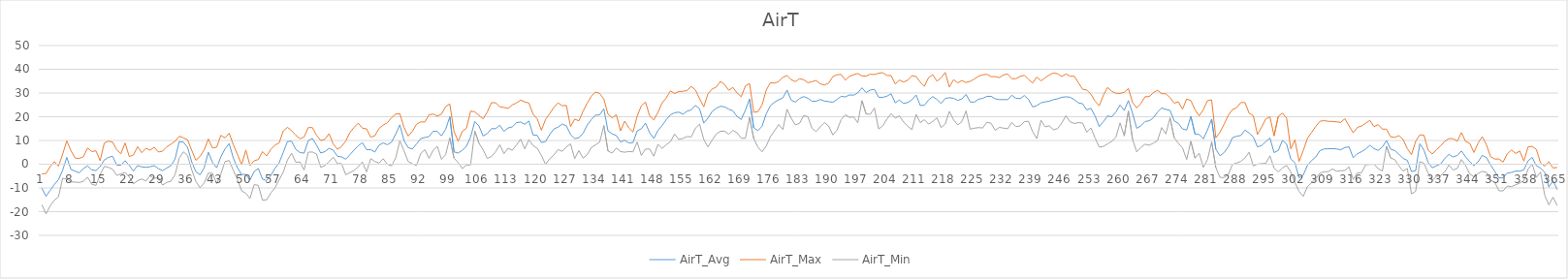
| Category | AirT_Avg | AirT_Max | AirT_Min |
|---|---|---|---|
| 0 | -10.09 | -4.06 | -17.07 |
| 1 | -13.53 | -3.93 | -20.97 |
| 2 | -10.99 | -1.04 | -17.57 |
| 3 | -8.54 | 1.11 | -15.17 |
| 4 | -6.53 | -0.81 | -13.77 |
| 5 | -2.54 | 4.24 | -5.93 |
| 6 | 2.87 | 9.84 | -6.26 |
| 7 | -2.27 | 5.65 | -7.48 |
| 8 | -2.92 | 2.6 | -7.51 |
| 9 | -3.63 | 2.43 | -7.71 |
| 10 | -1.83 | 3.17 | -7.18 |
| 11 | -0.67 | 6.86 | -5.51 |
| 12 | -2.39 | 5.33 | -8.49 |
| 13 | -2.67 | 5.64 | -8.93 |
| 14 | -1.03 | 1.46 | -4.4 |
| 15 | 1.79 | 8.93 | -0.92 |
| 16 | 2.9 | 9.71 | -1.31 |
| 17 | 3.34 | 9.31 | -2.16 |
| 18 | -0.39 | 6.01 | -4.73 |
| 19 | -0.37 | 4.42 | -4.06 |
| 20 | 1.49 | 8.94 | -3.52 |
| 21 | -0.5 | 3.21 | -5.35 |
| 22 | -2.88 | 3.88 | -8.29 |
| 23 | -0.56 | 7.39 | -6.97 |
| 24 | -1.12 | 4.83 | -6.22 |
| 25 | -1.32 | 6.71 | -7.1 |
| 26 | -1.09 | 5.92 | -4.87 |
| 27 | -0.59 | 7.16 | -5.98 |
| 28 | -1.87 | 5.13 | -5.65 |
| 29 | -2.72 | 5.5 | -8.79 |
| 30 | -1.62 | 7.29 | -7.68 |
| 31 | -0.62 | 8.45 | -7.17 |
| 32 | 2.18 | 9.63 | -4.43 |
| 33 | 9.49 | 11.79 | 2.57 |
| 34 | 9.3 | 11.12 | 5.23 |
| 35 | 7.14 | 10.31 | 3.65 |
| 36 | 1.01 | 5.89 | -2.36 |
| 37 | -3.16 | 1.65 | -7.31 |
| 38 | -4.47 | 3.28 | -9.91 |
| 39 | -1.49 | 6.01 | -7.88 |
| 40 | 5.05 | 10.64 | -3.76 |
| 41 | 0.71 | 6.84 | -3.83 |
| 42 | -1.5 | 7.19 | -8.19 |
| 43 | 3.07 | 12.16 | -4.13 |
| 44 | 6.43 | 11.09 | 1.11 |
| 45 | 8.71 | 13.04 | 1.56 |
| 46 | 2.56 | 8.19 | -2.57 |
| 47 | -1.52 | 4.06 | -6.46 |
| 48 | -4.38 | -0.27 | -11.21 |
| 49 | -4.3 | 5.96 | -12.23 |
| 50 | -6.71 | -0.56 | -14.39 |
| 51 | -3.1 | 1.46 | -8.63 |
| 52 | -1.77 | 1.96 | -8.88 |
| 53 | -6.31 | 5.31 | -15.17 |
| 54 | -6.87 | 3.49 | -15 |
| 55 | -4.81 | 6.21 | -12.15 |
| 56 | -1.7 | 8.08 | -9.92 |
| 57 | 0.58 | 8.95 | -6.6 |
| 58 | 5 | 14.02 | -3.31 |
| 59 | 9.57 | 15.52 | 1.79 |
| 60 | 9.69 | 14.13 | 4.63 |
| 61 | 6.25 | 12.19 | 0.84 |
| 62 | 4.92 | 10.74 | 0.95 |
| 63 | 4.65 | 11.45 | -2.47 |
| 64 | 9.93 | 15.45 | 5.07 |
| 65 | 10.87 | 15.42 | 5.14 |
| 66 | 7.98 | 12.14 | 4.23 |
| 67 | 4.7 | 9.97 | -1.34 |
| 68 | 5.31 | 10.51 | -0.51 |
| 69 | 6.68 | 12.87 | 1.02 |
| 70 | 5.94 | 8.48 | 3.01 |
| 71 | 3.35 | 6.29 | 0.23 |
| 72 | 3.08 | 7.47 | 0.24 |
| 73 | 2.11 | 9.76 | -4.43 |
| 74 | 4 | 13.33 | -3.52 |
| 75 | 5.96 | 15.5 | -2.63 |
| 76 | 7.76 | 17.29 | -1.11 |
| 77 | 9.09 | 15.18 | 0.94 |
| 78 | 6.14 | 14.89 | -3.24 |
| 79 | 6.12 | 11.39 | 2.36 |
| 80 | 5.14 | 12 | 1.12 |
| 81 | 8.01 | 15.1 | 0.47 |
| 82 | 8.99 | 16.49 | 2.33 |
| 83 | 8.2 | 17.46 | -0.03 |
| 84 | 9.29 | 19.6 | -0.71 |
| 85 | 12.66 | 21.12 | 2.7 |
| 86 | 16.59 | 21.29 | 9.83 |
| 87 | 9.95 | 15.46 | 5.64 |
| 88 | 6.98 | 11.86 | 1.14 |
| 89 | 6.4 | 13.86 | 0.19 |
| 90 | 8.52 | 16.79 | -0.57 |
| 91 | 10.75 | 17.81 | 4.46 |
| 92 | 11.24 | 17.8 | 6.15 |
| 93 | 11.62 | 20.78 | 2.47 |
| 94 | 13.89 | 21.13 | 5.92 |
| 95 | 13.83 | 20.27 | 7.53 |
| 96 | 11.95 | 21.11 | 2.03 |
| 97 | 14.71 | 24.29 | 4.06 |
| 98 | 19.99 | 25.38 | 11.08 |
| 99 | 5.2 | 13.82 | 2.6 |
| 100 | 4.7 | 9.69 | 0.68 |
| 101 | 5.86 | 13.89 | -1.86 |
| 102 | 7.57 | 15.13 | -0.34 |
| 103 | 11.5 | 22.37 | -0.3 |
| 104 | 17.98 | 22.07 | 13.97 |
| 105 | 16.11 | 20.58 | 8.88 |
| 106 | 11.89 | 19.12 | 6.05 |
| 107 | 12.92 | 21.99 | 2.43 |
| 108 | 15 | 25.92 | 3.21 |
| 109 | 14.94 | 25.89 | 5.28 |
| 110 | 16.43 | 24.23 | 8.27 |
| 111 | 13.84 | 23.89 | 4.46 |
| 112 | 15.28 | 23.52 | 6.73 |
| 113 | 15.73 | 24.97 | 5.86 |
| 114 | 17.48 | 25.78 | 8.08 |
| 115 | 17.78 | 27 | 10.54 |
| 116 | 16.82 | 26.26 | 6.46 |
| 117 | 18.21 | 25.75 | 10.31 |
| 118 | 12.31 | 21.09 | 7.84 |
| 119 | 12.14 | 19.09 | 6.69 |
| 120 | 9.13 | 14.29 | 3.75 |
| 121 | 9.57 | 18.88 | -0.09 |
| 122 | 12.53 | 21.32 | 2.33 |
| 123 | 14.86 | 23.96 | 3.89 |
| 124 | 15.64 | 25.86 | 6.15 |
| 125 | 16.93 | 24.63 | 5.44 |
| 126 | 16.16 | 24.77 | 7.23 |
| 127 | 12.47 | 15.86 | 8.55 |
| 128 | 10.79 | 18.99 | 2.37 |
| 129 | 11.14 | 18.28 | 5.75 |
| 130 | 13.01 | 22.33 | 2.54 |
| 131 | 16.49 | 25.72 | 3.96 |
| 132 | 18.83 | 28.67 | 7.07 |
| 133 | 20.64 | 30.39 | 8.14 |
| 134 | 20.82 | 29.83 | 9.32 |
| 135 | 23.32 | 27.39 | 16.26 |
| 136 | 14 | 21.09 | 5.53 |
| 137 | 12.79 | 19.53 | 4.7 |
| 138 | 12.06 | 20.87 | 6.79 |
| 139 | 9.38 | 14.02 | 5.33 |
| 140 | 10.12 | 18.18 | 5.04 |
| 141 | 8.96 | 15.31 | 5.34 |
| 142 | 9.07 | 13.56 | 5.21 |
| 143 | 14.02 | 20.23 | 9.34 |
| 144 | 14.94 | 24.63 | 3.72 |
| 145 | 17.35 | 26.23 | 6.36 |
| 146 | 13.24 | 20.38 | 6.39 |
| 147 | 10.84 | 18.65 | 3.38 |
| 148 | 14.21 | 21.86 | 8.35 |
| 149 | 16.32 | 25.85 | 6.63 |
| 150 | 18.78 | 27.94 | 8.21 |
| 151 | 20.81 | 30.89 | 9.53 |
| 152 | 21.69 | 29.78 | 12.71 |
| 153 | 21.93 | 30.61 | 10.44 |
| 154 | 21.08 | 30.72 | 10.85 |
| 155 | 22.37 | 31.06 | 11.66 |
| 156 | 22.87 | 32.78 | 11.49 |
| 157 | 24.77 | 31.28 | 15.18 |
| 158 | 23.34 | 27.56 | 16.87 |
| 159 | 17.32 | 24.16 | 10.44 |
| 160 | 19.41 | 29.61 | 7.27 |
| 161 | 22.19 | 31.67 | 10.11 |
| 162 | 23.54 | 32.5 | 12.74 |
| 163 | 24.42 | 34.89 | 13.86 |
| 164 | 24.15 | 33.56 | 13.96 |
| 165 | 23.18 | 31.17 | 12.61 |
| 166 | 22.51 | 32.33 | 14.26 |
| 167 | 20.09 | 30 | 13.25 |
| 168 | 18.84 | 28.44 | 10.99 |
| 169 | 22.83 | 33 | 10.95 |
| 170 | 27.38 | 34 | 19.71 |
| 171 | 15.33 | 21.87 | 10.84 |
| 172 | 14.14 | 22.13 | 7.2 |
| 173 | 15.97 | 24.94 | 5.21 |
| 174 | 21.15 | 31.17 | 7.61 |
| 175 | 24.67 | 34.33 | 11.59 |
| 176 | 26.13 | 34.17 | 14.09 |
| 177 | 27.16 | 34.83 | 16.73 |
| 178 | 27.92 | 36.61 | 14.6 |
| 179 | 31.24 | 37.33 | 23.15 |
| 180 | 27.01 | 35.61 | 19.37 |
| 181 | 26.16 | 34.78 | 16.57 |
| 182 | 27.69 | 36 | 17.21 |
| 183 | 28.5 | 35.61 | 20.46 |
| 184 | 27.81 | 34.33 | 20.05 |
| 185 | 26.5 | 34.78 | 15.11 |
| 186 | 26.56 | 35.28 | 13.76 |
| 187 | 27.27 | 33.83 | 15.78 |
| 188 | 26.6 | 33.39 | 17.54 |
| 189 | 26.36 | 34.17 | 16.09 |
| 190 | 26.1 | 36.89 | 12.33 |
| 191 | 27.26 | 37.72 | 14.36 |
| 192 | 28.62 | 37.83 | 18.77 |
| 193 | 28.36 | 35.44 | 20.83 |
| 194 | 29.19 | 37 | 19.74 |
| 195 | 29.09 | 37.72 | 19.92 |
| 196 | 30.02 | 38.22 | 17.45 |
| 197 | 32.2 | 37.22 | 26.78 |
| 198 | 30.18 | 37.11 | 21.13 |
| 199 | 31.25 | 37.94 | 21.03 |
| 200 | 31.51 | 37.78 | 23.68 |
| 201 | 28.22 | 38.33 | 14.81 |
| 202 | 28.16 | 38.56 | 16.16 |
| 203 | 28.66 | 37.39 | 19.01 |
| 204 | 29.68 | 37.33 | 21.29 |
| 205 | 25.88 | 33.78 | 19.41 |
| 206 | 26.99 | 35.44 | 20.38 |
| 207 | 25.6 | 34.61 | 17.72 |
| 208 | 26 | 35.39 | 15.99 |
| 209 | 27.11 | 37.33 | 14.54 |
| 210 | 29.19 | 36.94 | 20.99 |
| 211 | 24.74 | 34.56 | 17.54 |
| 212 | 24.83 | 32.83 | 18.73 |
| 213 | 27.07 | 36.5 | 16.91 |
| 214 | 28.5 | 37.72 | 18.02 |
| 215 | 27.32 | 35 | 19.57 |
| 216 | 25.56 | 36.33 | 15.45 |
| 217 | 27.71 | 38.67 | 16.94 |
| 218 | 28 | 32.5 | 22.28 |
| 219 | 27.79 | 35.61 | 18.69 |
| 220 | 26.89 | 34.22 | 16.57 |
| 221 | 27.51 | 35.28 | 17.94 |
| 222 | 29.42 | 34.39 | 22.44 |
| 223 | 26.21 | 34.94 | 14.74 |
| 224 | 26.17 | 35.89 | 15.18 |
| 225 | 27.4 | 37.06 | 15.42 |
| 226 | 27.72 | 37.67 | 15.28 |
| 227 | 28.59 | 37.89 | 17.68 |
| 228 | 28.59 | 36.89 | 17.27 |
| 229 | 27.57 | 36.89 | 14.3 |
| 230 | 27.22 | 36.5 | 15.52 |
| 231 | 27.24 | 37.61 | 15.21 |
| 232 | 27.2 | 38 | 14.94 |
| 233 | 29.05 | 36 | 17.61 |
| 234 | 27.79 | 36.06 | 15.85 |
| 235 | 27.6 | 37 | 16.13 |
| 236 | 28.94 | 37.44 | 17.92 |
| 237 | 27.33 | 35.78 | 18.09 |
| 238 | 24.13 | 34.17 | 13.69 |
| 239 | 24.71 | 36.72 | 10.79 |
| 240 | 25.85 | 35.11 | 18.53 |
| 241 | 26.28 | 36.39 | 15.79 |
| 242 | 26.56 | 37.61 | 16.19 |
| 243 | 27.21 | 38.44 | 14.5 |
| 244 | 27.56 | 38.11 | 15.01 |
| 245 | 28.18 | 36.94 | 17.41 |
| 246 | 28.4 | 38 | 20.42 |
| 247 | 28.22 | 37.06 | 17.82 |
| 248 | 27.19 | 37.06 | 17.17 |
| 249 | 25.82 | 34.33 | 17.52 |
| 250 | 25.46 | 31.56 | 17.34 |
| 251 | 22.9 | 31.22 | 13.49 |
| 252 | 23.54 | 29.5 | 15.29 |
| 253 | 20.32 | 26.53 | 11.05 |
| 254 | 15.85 | 24.63 | 7.21 |
| 255 | 17.95 | 29.11 | 7.48 |
| 256 | 20.34 | 32.33 | 8.56 |
| 257 | 19.98 | 30.72 | 9.63 |
| 258 | 21.99 | 29.89 | 11.33 |
| 259 | 24.95 | 29.83 | 17.41 |
| 260 | 22.64 | 30.33 | 11.93 |
| 261 | 26.81 | 31.89 | 22.38 |
| 262 | 21.41 | 25.99 | 10.44 |
| 263 | 15.13 | 23.72 | 5.18 |
| 264 | 16.16 | 25.58 | 7.11 |
| 265 | 17.98 | 28.44 | 8.42 |
| 266 | 18.28 | 28.5 | 7.98 |
| 267 | 19.55 | 30.11 | 8.89 |
| 268 | 21.97 | 31.17 | 9.96 |
| 269 | 23.68 | 29.72 | 15.44 |
| 270 | 23.07 | 29.67 | 12.75 |
| 271 | 22.69 | 28.06 | 19.56 |
| 272 | 18.28 | 25.71 | 11.15 |
| 273 | 17.2 | 26.28 | 8.86 |
| 274 | 14.89 | 23.19 | 6.88 |
| 275 | 14.37 | 27.44 | 1.95 |
| 276 | 20.19 | 26.83 | 9.67 |
| 277 | 12.64 | 22.94 | 2.54 |
| 278 | 12.53 | 20.37 | 4.66 |
| 279 | 10.69 | 22.96 | -1.33 |
| 280 | 14.43 | 26.78 | 1.94 |
| 281 | 18.99 | 27.11 | 9.42 |
| 282 | 6.34 | 11.08 | -1.36 |
| 283 | 3.55 | 13.46 | -5.56 |
| 284 | 4.91 | 16.87 | -5.66 |
| 285 | 7.36 | 20.63 | -4.29 |
| 286 | 11.17 | 23.02 | -0.08 |
| 287 | 11.8 | 23.78 | 0.47 |
| 288 | 12.08 | 25.98 | 1.2 |
| 289 | 14.39 | 26 | 2.66 |
| 290 | 13.14 | 21.49 | 5.03 |
| 291 | 11.5 | 20.42 | -0.76 |
| 292 | 7.29 | 12.52 | 0.04 |
| 293 | 7.89 | 15.67 | 0.23 |
| 294 | 9.49 | 19.07 | 0.34 |
| 295 | 11.06 | 19.98 | 3.52 |
| 296 | 4.89 | 11.96 | -1.65 |
| 297 | 5.78 | 20.14 | -3.23 |
| 298 | 10.03 | 21.53 | -1.57 |
| 299 | 8.47 | 19.42 | -0.51 |
| 300 | 2.24 | 6.48 | -3.3 |
| 301 | 0.58 | 10.26 | -7.72 |
| 302 | -5.77 | 1.16 | -11.49 |
| 303 | -4.58 | 5.73 | -13.55 |
| 304 | -0.49 | 10.86 | -9.48 |
| 305 | 1.56 | 13.38 | -7.81 |
| 306 | 3.03 | 15.89 | -6.2 |
| 307 | 5.72 | 18.09 | -3.79 |
| 308 | 6.42 | 18.36 | -3.18 |
| 309 | 6.5 | 18.08 | -3.12 |
| 310 | 6.57 | 18.03 | -2.01 |
| 311 | 6.42 | 17.84 | -2.94 |
| 312 | 6.07 | 17.61 | -2.78 |
| 313 | 7.01 | 19.18 | -2.62 |
| 314 | 7.33 | 16.14 | -1.13 |
| 315 | 2.74 | 13.23 | -6.43 |
| 316 | 4.41 | 15.51 | -3.62 |
| 317 | 5.28 | 16.09 | -3.61 |
| 318 | 6.4 | 17.25 | -0.2 |
| 319 | 7.96 | 18.49 | -0.1 |
| 320 | 6.55 | 15.83 | -0.02 |
| 321 | 5.8 | 16.68 | -1.85 |
| 322 | 7.24 | 14.81 | -2.92 |
| 323 | 9.97 | 14.74 | 7.53 |
| 324 | 6.34 | 11.49 | 2.61 |
| 325 | 5.75 | 11.32 | 1.92 |
| 326 | 4.21 | 12.02 | -0.75 |
| 327 | 2.43 | 10.38 | -2.91 |
| 328 | 1.64 | 6.56 | -1.78 |
| 329 | -3.07 | 4.02 | -12.5 |
| 330 | -2.77 | 9.62 | -11.42 |
| 331 | 8.63 | 12.39 | 1.07 |
| 332 | 5.89 | 12.19 | 0.41 |
| 333 | 0.73 | 5.89 | -3.79 |
| 334 | -1.51 | 4.28 | -6.79 |
| 335 | -0.64 | 6.04 | -5.19 |
| 336 | 0.06 | 7.73 | -4.82 |
| 337 | 2.47 | 9.66 | -3.23 |
| 338 | 4.13 | 10.83 | -0.33 |
| 339 | 3.08 | 10.72 | -2.42 |
| 340 | 3.65 | 9.72 | -1.77 |
| 341 | 5.57 | 13.31 | 1.98 |
| 342 | 3.11 | 9.59 | -0.56 |
| 343 | 1.12 | 8.82 | -4.11 |
| 344 | -0.62 | 4.93 | -5.32 |
| 345 | 1.02 | 8.93 | -3.93 |
| 346 | 3.73 | 11.59 | -2.99 |
| 347 | 2.79 | 8.21 | -3.43 |
| 348 | -0.26 | 3.2 | -6.81 |
| 349 | -2.98 | 2.16 | -7.55 |
| 350 | -5.73 | 2.21 | -11.17 |
| 351 | -5.75 | 0.87 | -11.27 |
| 352 | -3.76 | 4.34 | -9.21 |
| 353 | -3.48 | 5.97 | -9.45 |
| 354 | -2.89 | 4.51 | -8.72 |
| 355 | -2.92 | 5.56 | -7.94 |
| 356 | -2.38 | 1.32 | -6.91 |
| 357 | 1.43 | 7.28 | -2.09 |
| 358 | 2.87 | 7.51 | 0.06 |
| 359 | -0.66 | 6.23 | -5.58 |
| 360 | -1.63 | 0.52 | -3.32 |
| 361 | -3.38 | -0.86 | -13.09 |
| 362 | -9.63 | 1.07 | -17.13 |
| 363 | -7 | -1.58 | -13.9 |
| 364 | -10.68 | -1.4 | -17.41 |